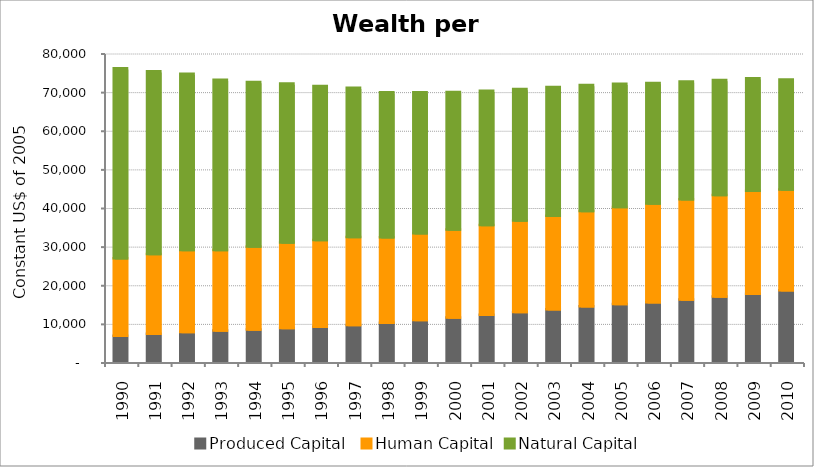
| Category | Produced Capital  | Human Capital | Natural Capital |
|---|---|---|---|
| 1990.0 | 6751.046 | 20052.297 | 49156.066 |
| 1991.0 | 7274.571 | 20621.63 | 47340.649 |
| 1992.0 | 7700.207 | 21210.403 | 45632.354 |
| 1993.0 | 8062.612 | 20876.866 | 44046.413 |
| 1994.0 | 8377.548 | 21488.603 | 42558.121 |
| 1995.0 | 8757.855 | 22125.23 | 41162.257 |
| 1996.0 | 9069.55 | 22436.106 | 39868.604 |
| 1997.0 | 9524.821 | 22754.694 | 38657.515 |
| 1998.0 | 10108.697 | 22111.595 | 37532.148 |
| 1999.0 | 10798.625 | 22446.097 | 36514.648 |
| 2000.0 | 11471.521 | 22782.693 | 35606.12 |
| 2001.0 | 12163.195 | 23236.118 | 34756.252 |
| 2002.0 | 12891.305 | 23707.987 | 34009.06 |
| 2003.0 | 13611.763 | 24191.091 | 33298.487 |
| 2004.0 | 14338.865 | 24673.568 | 32614.619 |
| 2005.0 | 14935.043 | 25146.118 | 31919.371 |
| 2006.0 | 15434.582 | 25546.986 | 31205.986 |
| 2007.0 | 16121.017 | 25923.684 | 30494.364 |
| 2008.0 | 16864.351 | 26282.688 | 29802.547 |
| 2009.0 | 17631.709 | 26637.604 | 29131.81 |
| 2010.0 | 18507.492 | 26098.099 | 28487.599 |